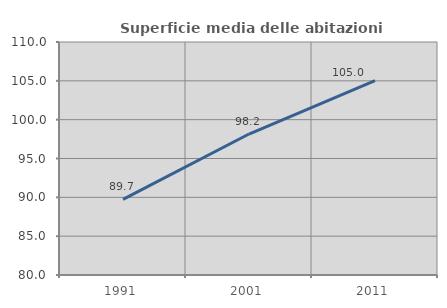
| Category | Superficie media delle abitazioni occupate |
|---|---|
| 1991.0 | 89.746 |
| 2001.0 | 98.151 |
| 2011.0 | 105.028 |